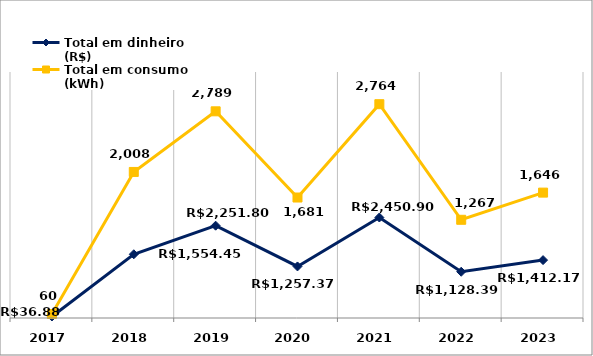
| Category | Total em dinheiro (R$) | Total em consumo (kWh) |
|---|---|---|
| 2017.0 | 36.88 | 60 |
| 2018.0 | 1554.45 | 2008 |
| 2019.0 | 2251.8 | 2789 |
| 2020.0 | 1257.37 | 1681 |
| 2021.0 | 2450.9 | 2764 |
| 2022.0 | 1128.39 | 1267 |
| 2023.0 | 1412.17 | 1646 |